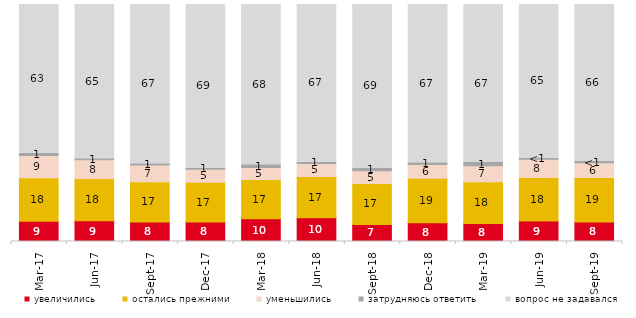
| Category | увеличились | остались прежними | уменьшились | затрудняюсь ответить | вопрос не задавался |
|---|---|---|---|---|---|
| 2017-03-01 | 8.5 | 18.35 | 9.4 | 0.95 | 62.8 |
| 2017-06-01 | 8.8 | 17.75 | 7.9 | 0.5 | 65.05 |
| 2017-09-01 | 8.2 | 17 | 7.1 | 0.5 | 67.2 |
| 2017-12-01 | 8.25 | 16.8 | 5.4 | 0.5 | 69.05 |
| 2018-03-01 | 9.55 | 16.65 | 5.05 | 1.1 | 67.65 |
| 2018-06-01 | 10 | 17.45 | 5.45 | 0.55 | 66.55 |
| 2018-09-01 | 7.2 | 17.3 | 5.3 | 1.2 | 69 |
| 2018-12-01 | 7.9 | 18.8 | 5.8 | 0.75 | 66.75 |
| 2019-03-01 | 7.608 | 17.653 | 6.713 | 1.343 | 66.683 |
| 2019-06-01 | 8.678 | 18.354 | 7.631 | 0.499 | 64.838 |
| 2019-09-01 | 8.267 | 18.762 | 6.188 | 0.495 | 66.287 |